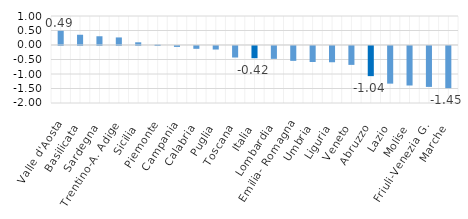
| Category | Series 0 |
|---|---|
| Valle d'Aosta | 0.49 |
| Basilicata | 0.354 |
| Sardegna | 0.301 |
| Trentino-A. Adige | 0.261 |
| Sicilia | 0.093 |
| Piemonte | 0.014 |
| Campania | -0.031 |
| Calabria | -0.097 |
| Puglia | -0.122 |
| Toscana | -0.397 |
| Italia | -0.421 |
| Lombardia | -0.443 |
| Emilia- Romagna | -0.512 |
| Umbria | -0.552 |
| Liguria | -0.56 |
| Veneto | -0.651 |
| Abruzzo | -1.039 |
| Lazio | -1.298 |
| Molise | -1.362 |
| Friuli-Venezia G. | -1.411 |
| Marche | -1.454 |